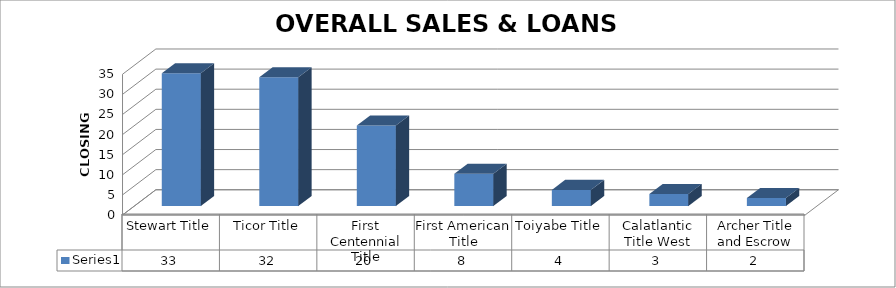
| Category | Series 0 |
|---|---|
| Stewart Title | 33 |
| Ticor Title | 32 |
| First Centennial Title | 20 |
| First American Title | 8 |
| Toiyabe Title | 4 |
| Calatlantic Title West | 3 |
| Archer Title and Escrow | 2 |